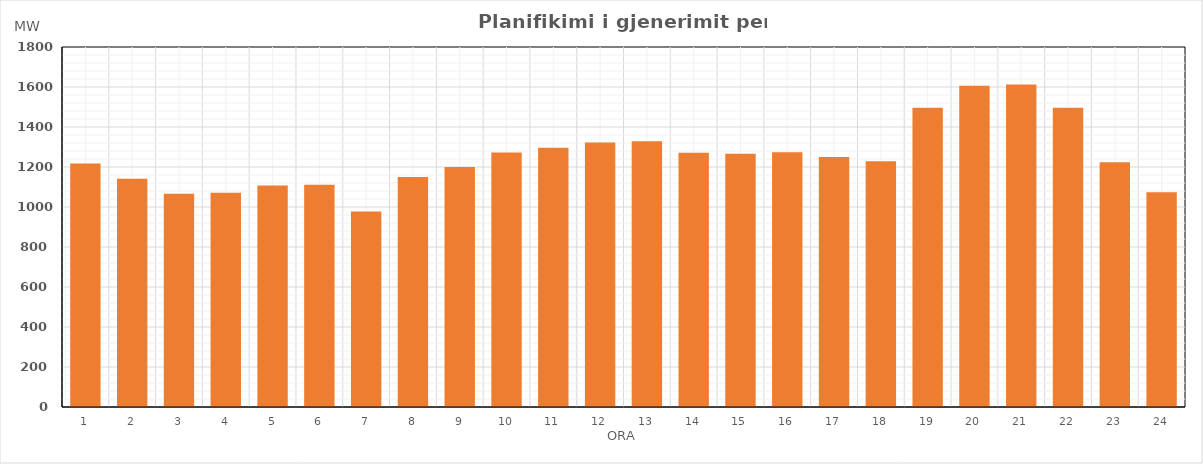
| Category | Max (MW) |
|---|---|
| 0 | 1216.889 |
| 1 | 1140.807 |
| 2 | 1066.448 |
| 3 | 1070.871 |
| 4 | 1107.906 |
| 5 | 1111.437 |
| 6 | 976.885 |
| 7 | 1150.348 |
| 8 | 1199.992 |
| 9 | 1272.614 |
| 10 | 1296.358 |
| 11 | 1322.164 |
| 12 | 1329.341 |
| 13 | 1271.063 |
| 14 | 1265.776 |
| 15 | 1274.271 |
| 16 | 1249.788 |
| 17 | 1228.404 |
| 18 | 1495.882 |
| 19 | 1605.96 |
| 20 | 1612.147 |
| 21 | 1495.75 |
| 22 | 1223.644 |
| 23 | 1073.541 |